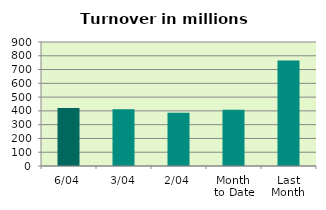
| Category | Series 0 |
|---|---|
| 6/04 | 421.039 |
| 3/04 | 412.77 |
| 2/04 | 386.6 |
| Month 
to Date | 408.361 |
| Last
Month | 765.33 |